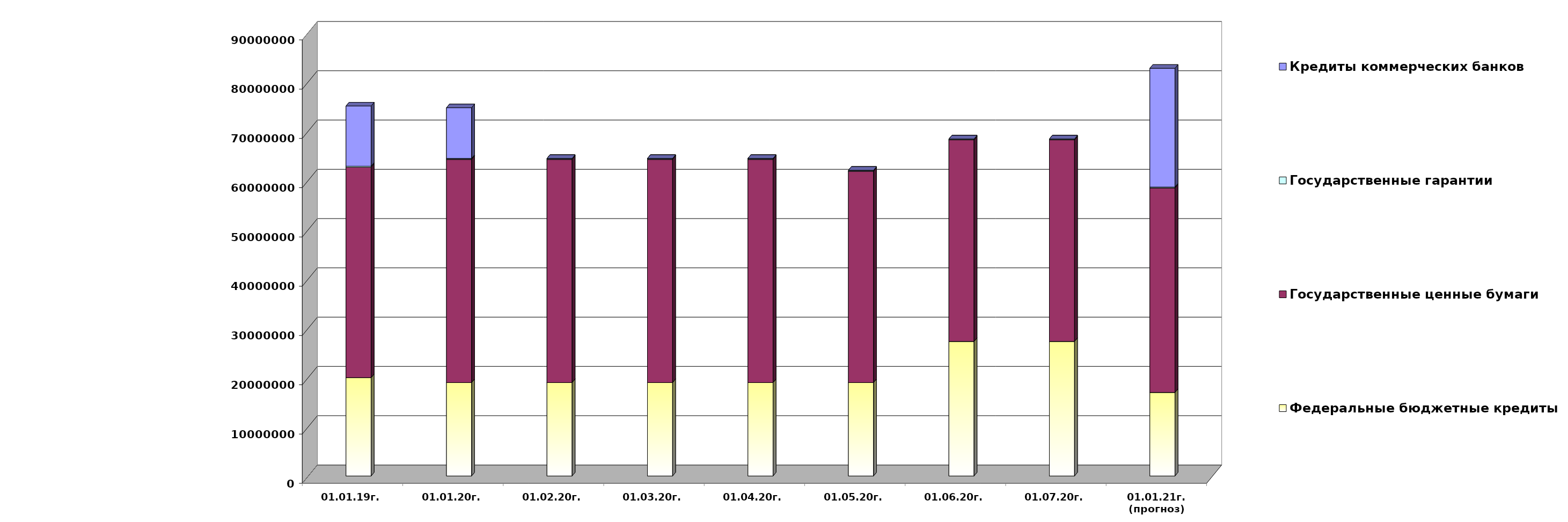
| Category | Федеральные бюджетные кредиты | Государственные ценные бумаги  | Государственные гарантии | Кредиты коммерческих банков |
|---|---|---|---|---|
| 01.01.19г. | 19957026.213 | 42700000 | 209872.86 | 12219963.75 |
| 01.01.20г. | 18954967.463 | 45300000 | 186330.02 | 10291177 |
| 01.02.20г. | 18954967.463 | 45300000 | 184738.25 | 0 |
| 01.03.20г. | 18954967.463 | 45300000 | 184738.25 | 0 |
| 01.04.20г. | 18954967.463 | 45300000 | 184738.25 | 0 |
| 01.05.20г. | 18954967.463 | 42900000 | 184738.25 | 0 |
| 01.06.20г. | 27303300.463 | 40900000 | 184738.25 | 0 |
| 01.07.20г. | 27303300.463 | 40900000 | 184738.25 | 0 |
| 01.01.21г.
(прогноз) | 16950850 | 41500000 | 184738.2 | 24104738.7 |